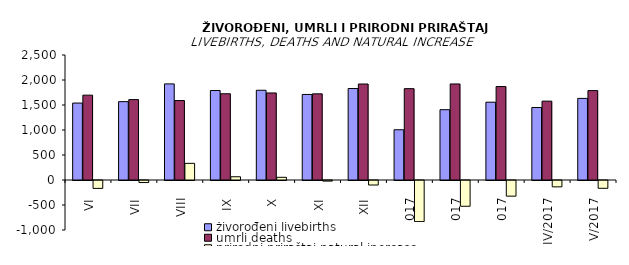
| Category | živorođeni livebirths | umrli deaths | prirodni priraštaj natural increase |
|---|---|---|---|
| VI | 1539 | 1697 | -158 |
| VII | 1567 | 1608 | -41 |
| VIII | 1922 | 1589 | 333 |
| IX | 1790 | 1725 | 65 |
| X | 1795 | 1741 | 54 |
| XI | 1711 | 1723 | -12 |
| XII | 1830 | 1920 | -90 |
| I/2017 | 1005 | 1827 | -822 |
| II/2017 | 1406 | 1921 | -515 |
| III/2017 | 1556 | 1869 | -313 |
| IV/2017 | 1450 | 1577 | -127 |
| V/2017 | 1632 | 1788 | -156 |